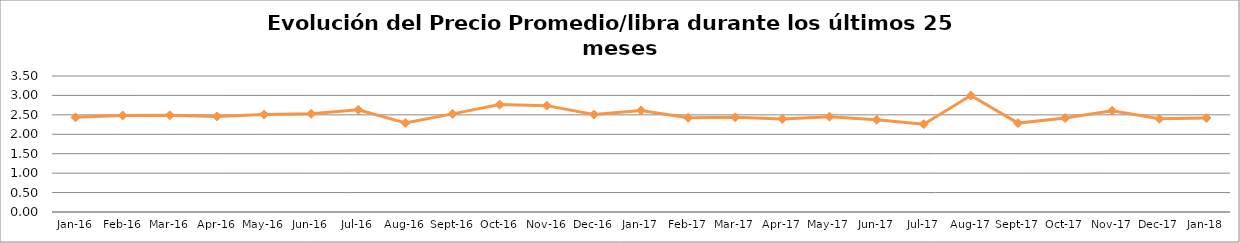
| Category | Series 0 |
|---|---|
| 2016-01-01 | 2.436 |
| 2016-02-01 | 2.484 |
| 2016-03-01 | 2.488 |
| 2016-04-01 | 2.46 |
| 2016-05-01 | 2.506 |
| 2016-06-01 | 2.527 |
| 2016-07-01 | 2.631 |
| 2016-08-01 | 2.292 |
| 2016-09-01 | 2.525 |
| 2016-10-01 | 2.764 |
| 2016-11-01 | 2.737 |
| 2016-12-01 | 2.508 |
| 2017-01-01 | 2.615 |
| 2017-02-01 | 2.424 |
| 2017-03-01 | 2.436 |
| 2017-04-01 | 2.396 |
| 2017-05-01 | 2.452 |
| 2017-06-01 | 2.372 |
| 2017-07-01 | 2.26 |
| 2017-08-01 | 2.997 |
| 2017-09-01 | 2.288 |
| 2017-10-01 | 2.421 |
| 2017-11-01 | 2.605 |
| 2017-12-01 | 2.4 |
| 2018-01-01 | 2.42 |